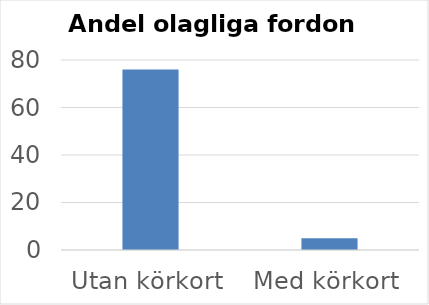
| Category | Andel % |
|---|---|
| Utan körkort | 76 |
| Med körkort | 5 |